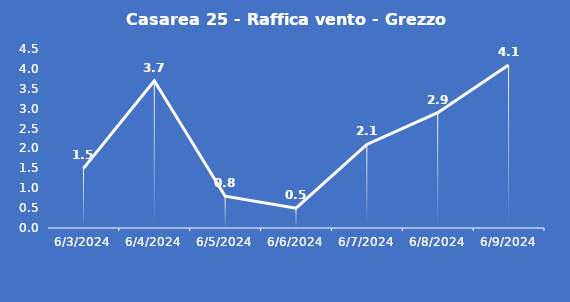
| Category | Casarea 25 - Raffica vento - Grezzo (m/s) |
|---|---|
| 6/3/24 | 1.5 |
| 6/4/24 | 3.7 |
| 6/5/24 | 0.8 |
| 6/6/24 | 0.5 |
| 6/7/24 | 2.1 |
| 6/8/24 | 2.9 |
| 6/9/24 | 4.1 |